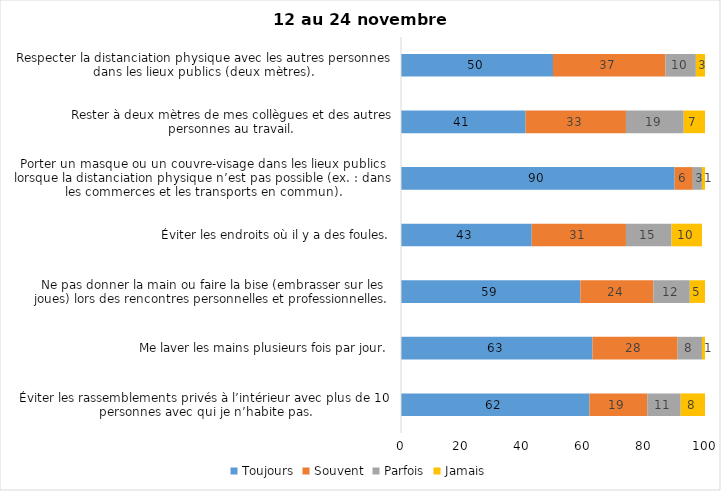
| Category | Toujours | Souvent | Parfois | Jamais |
|---|---|---|---|---|
| Éviter les rassemblements privés à l’intérieur avec plus de 10 personnes avec qui je n’habite pas. | 62 | 19 | 11 | 8 |
| Me laver les mains plusieurs fois par jour. | 63 | 28 | 8 | 1 |
| Ne pas donner la main ou faire la bise (embrasser sur les joues) lors des rencontres personnelles et professionnelles. | 59 | 24 | 12 | 5 |
| Éviter les endroits où il y a des foules. | 43 | 31 | 15 | 10 |
| Porter un masque ou un couvre-visage dans les lieux publics lorsque la distanciation physique n’est pas possible (ex. : dans les commerces et les transports en commun). | 90 | 6 | 3 | 1 |
| Rester à deux mètres de mes collègues et des autres personnes au travail. | 41 | 33 | 19 | 7 |
| Respecter la distanciation physique avec les autres personnes dans les lieux publics (deux mètres). | 50 | 37 | 10 | 3 |